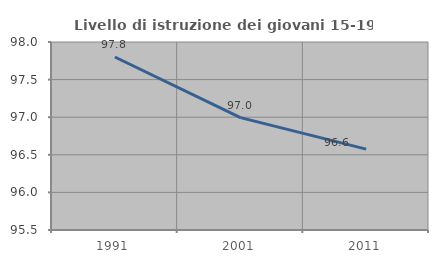
| Category | Livello di istruzione dei giovani 15-19 anni |
|---|---|
| 1991.0 | 97.8 |
| 2001.0 | 96.994 |
| 2011.0 | 96.575 |